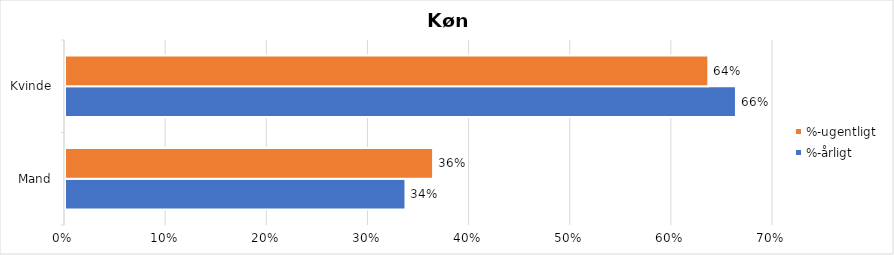
| Category | %-årligt | %-ugentligt |
|---|---|---|
| Mand | 0.337 | 0.364 |
| Kvinde | 0.663 | 0.636 |